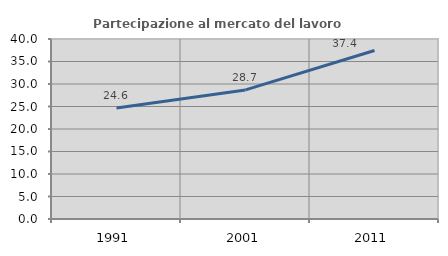
| Category | Partecipazione al mercato del lavoro  femminile |
|---|---|
| 1991.0 | 24.642 |
| 2001.0 | 28.682 |
| 2011.0 | 37.432 |